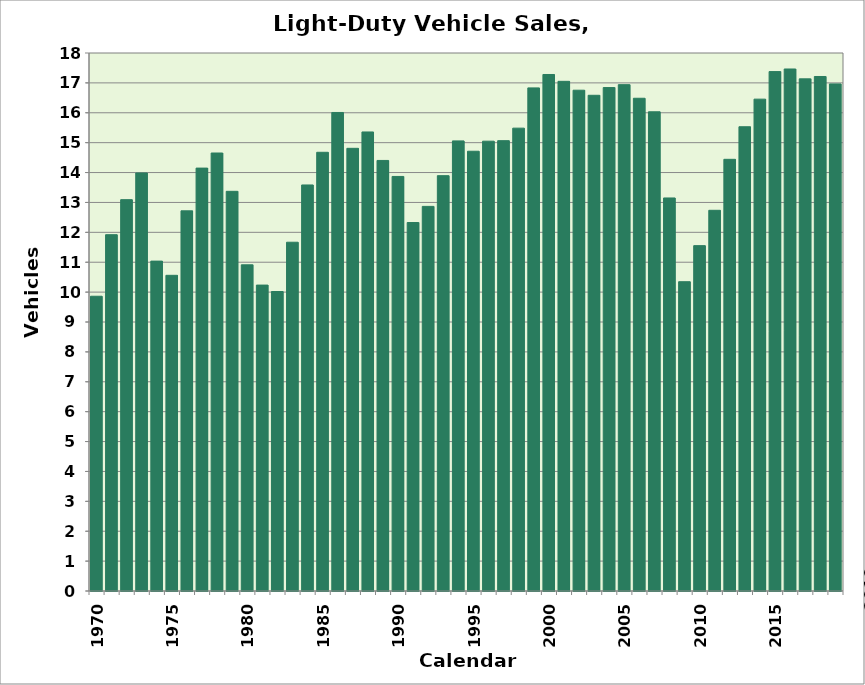
| Category | Light-Duty Vehicle Sales (Millions) |
|---|---|
| 1970.0 | 9.862 |
| 1971.0 | 11.921 |
| 1972.0 | 13.093 |
| 1973.0 | 13.986 |
| 1974.0 | 11.037 |
| 1975.0 | 10.562 |
| 1976.0 | 12.719 |
| 1977.0 | 14.149 |
| 1978.0 | 14.654 |
| 1979.0 | 13.372 |
| 1980.0 | 10.913 |
| 1981.0 | 10.235 |
| 1982.0 | 10.02 |
| 1983.0 | 11.669 |
| 1984.0 | 13.585 |
| 1985.0 | 14.678 |
| 1986.0 | 16.01 |
| 1987.0 | 14.811 |
| 1988.0 | 15.358 |
| 1989.0 | 14.405 |
| 1990.0 | 13.87 |
| 1991.0 | 12.328 |
| 1992.0 | 12.868 |
| 1993.0 | 13.896 |
| 1994.0 | 15.059 |
| 1995.0 | 14.713 |
| 1996.0 | 15.05 |
| 1997.0 | 15.067 |
| 1998.0 | 15.486 |
| 1999.0 | 16.833 |
| 2000.0 | 17.281 |
| 2001.0 | 17.052 |
| 2002.0 | 16.755 |
| 2003.0 | 16.585 |
| 2004.0 | 16.844 |
| 2005.0 | 16.941 |
| 2006.0 | 16.486 |
| 2007.0 | 16.033 |
| 2008.0 | 13.15 |
| 2009.0 | 10.348 |
| 2010.0 | 11.555 |
| 2011.0 | 12.737 |
| 2012.0 | 14.443 |
| 2013.0 | 15.533 |
| 2014.0 | 16.456 |
| 2015.0 | 17.378 |
| 2016.0 | 17.465 |
| 2017.0 | 17.135 |
| 2018.0 | 17.214 |
| 2019.0 | 16.965 |